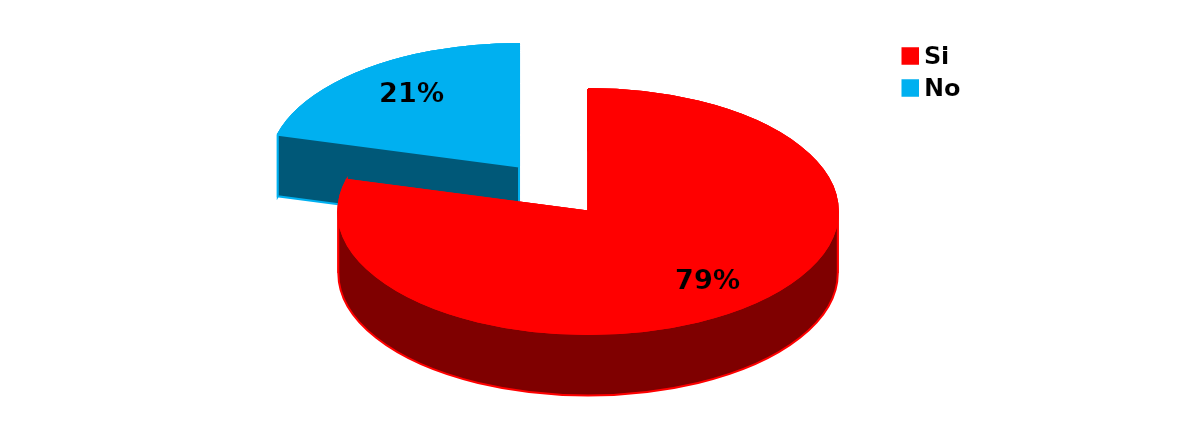
| Category | Series 0 |
|---|---|
| Si | 57 |
| No | 15 |